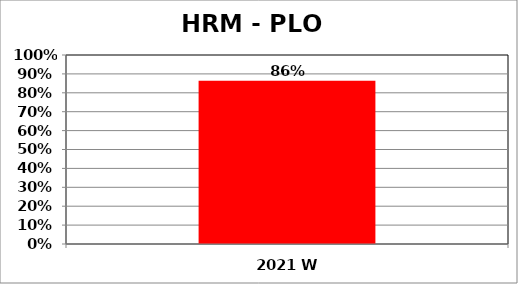
| Category | Series 0 |
|---|---|
| 2021 W | 0.864 |